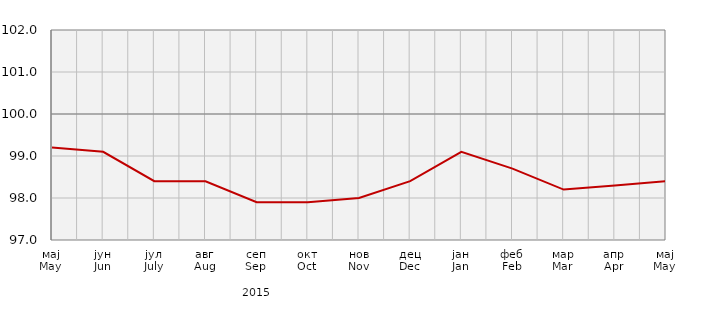
| Category | Индекси потрошачких цијена
Consumer price indices |
|---|---|
| мај
May | 99.2 |
| јун
Jun | 99.1 |
| јул
July | 98.4 |
| авг
Aug | 98.4 |
| сеп
Sep | 97.9 |
| окт
Oct | 97.9 |
| нов
Nov | 98 |
| дец
Dec | 98.4 |
| јан
Jan | 99.1 |
| феб
Feb | 98.7 |
| мар
Mar | 98.2 |
| апр
Apr | 98.3 |
| мај
May | 98.4 |